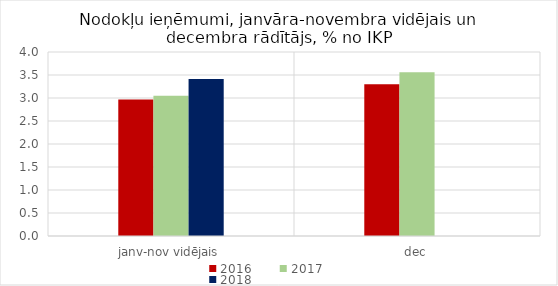
| Category | 2016 | 2017 | 2018 |
|---|---|---|---|
| janv-nov vidējais | 2.97 | 3.049 | 3.412 |
| dec | 3.301 | 3.562 | 0 |